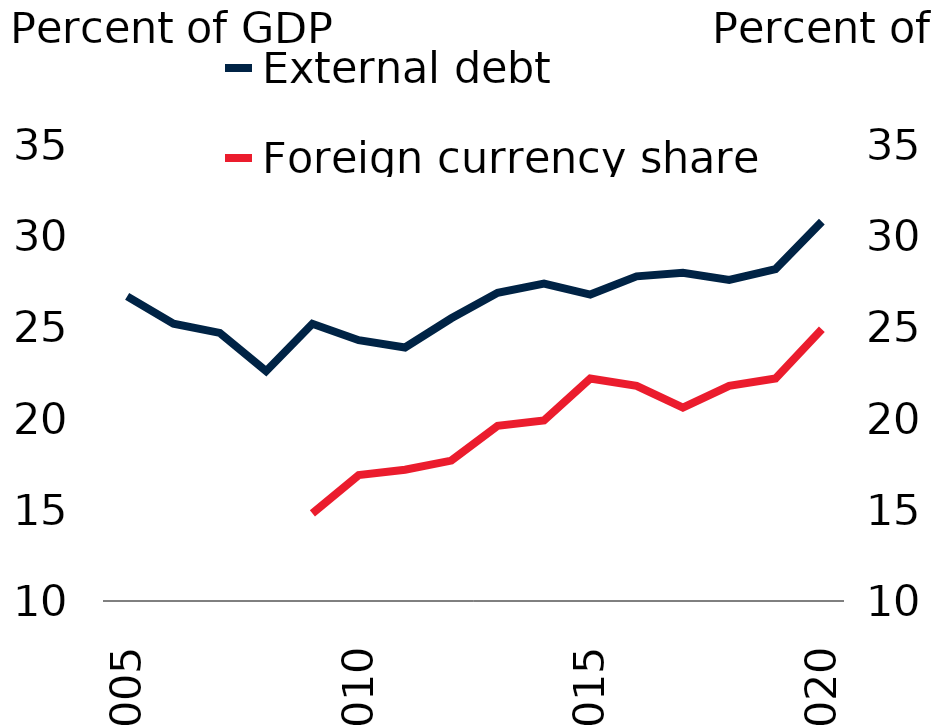
| Category | External debt |
|---|---|
| 2005.0 | 26.7 |
| 2006.0 | 25.2 |
| 2007.0 | 24.7 |
| 2008.0 | 22.6 |
| 2009.0 | 25.2 |
| 2010.0 | 24.3 |
| 2011.0 | 23.9 |
| 2012.0 | 25.5 |
| 2013.0 | 26.9 |
| 2014.0 | 27.4 |
| 2015.0 | 26.8 |
| 2016.0 | 27.8 |
| 2017.0 | 28 |
| 2018.0 | 27.6 |
| 2019.0 | 28.2 |
| 2020.0 | 30.8 |